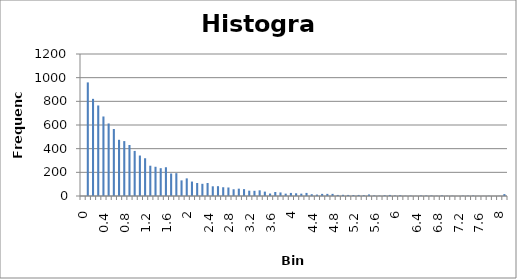
| Category | Series 0 |
|---|---|
| 0 | 0 |
| 0.1 | 960 |
| 0.2 | 821 |
| 0.3 | 765 |
| 0.4 | 672 |
| 0.5 | 613 |
| 0.6 | 566 |
| 0.7 | 475 |
| 0.8 | 464 |
| 0.9 | 431 |
| 1 | 381 |
| 1.1 | 342 |
| 1.2 | 319 |
| 1.3 | 256 |
| 1.4 | 247 |
| 1.5 | 235 |
| 1.6 | 243 |
| 1.7 | 190 |
| 1.8 | 193 |
| 1.9 | 132 |
| 2 | 149 |
| 2.1 | 122 |
| 2.2 | 110 |
| 2.3 | 103 |
| 2.4 | 110 |
| 2.5 | 82 |
| 2.6 | 83 |
| 2.7 | 74 |
| 2.8 | 72 |
| 2.9 | 57 |
| 3 | 62 |
| 3.1 | 58 |
| 3.2 | 45 |
| 3.3 | 44 |
| 3.4 | 48 |
| 3.5 | 37 |
| 3.6 | 21 |
| 3.7 | 34 |
| 3.8 | 30 |
| 3.9 | 20 |
| 4 | 26 |
| 4.1 | 23 |
| 4.2 | 20 |
| 4.3 | 26 |
| 4.4 | 15 |
| 4.5 | 12 |
| 4.6 | 18 |
| 4.7 | 18 |
| 4.8 | 18 |
| 4.9 | 9 |
| 5 | 10 |
| 5.1 | 9 |
| 5.2 | 8 |
| 5.3 | 9 |
| 5.4 | 7 |
| 5.5 | 13 |
| 5.6 | 5 |
| 5.7 | 3 |
| 5.8 | 6 |
| 5.9 | 9 |
| 6 | 4 |
| 6.1 | 6 |
| 6.2 | 2 |
| 6.3 | 3 |
| 6.4 | 1 |
| 6.5 | 4 |
| 6.6 | 4 |
| 6.7 | 4 |
| 6.8 | 2 |
| 6.9 | 5 |
| 7 | 2 |
| 7.1 | 2 |
| 7.2 | 0 |
| 7.3 | 3 |
| 7.4 | 3 |
| 7.5 | 4 |
| 7.6 | 1 |
| 7.7 | 1 |
| 7.8 | 2 |
| 7.9 | 0 |
| 8 | 1 |
| More | 16 |